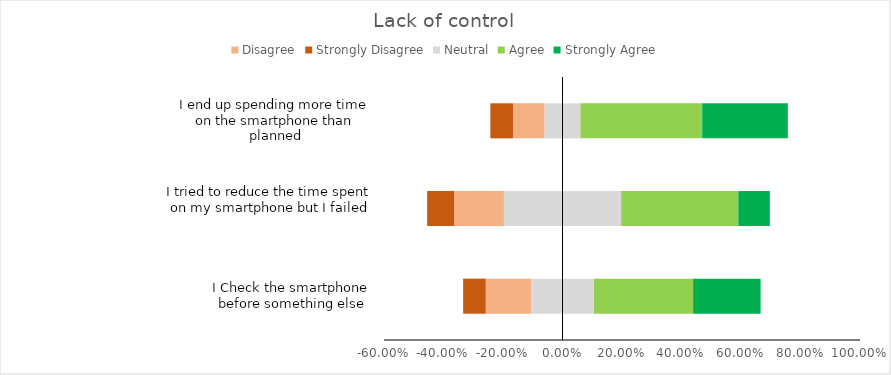
| Category | Neutral | Disagree | Strongly Disagree | Agree | Strongly Agree |
|---|---|---|---|---|---|
| I Check the smartphone before something else | 0.106 | -0.152 | -0.076 | 0.333 | 0.227 |
| I tried to reduce the time spent on my smartphone but I failed | 0.197 | -0.167 | -0.091 | 0.394 | 0.106 |
| I end up spending more time on the smartphone than planned | 0.06 | -0.106 | -0.076 | 0.409 | 0.288 |